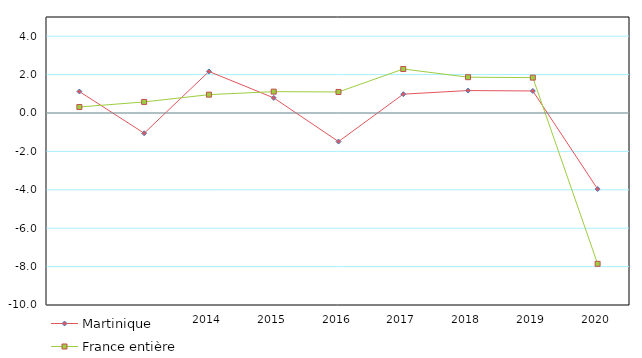
| Category | Martinique | France entière |
|---|---|---|
| 2012 | 1.119 | 0.313 |
| 2013 | -1.055 | 0.576 |
| 2014 | 2.164 | 0.956 |
| 2015 | 0.787 | 1.113 |
| 2016 | -1.488 | 1.095 |
| 2017 | 0.981 | 2.291 |
| 2018 | 1.169 | 1.865 |
| 2019 | 1.148 | 1.843 |
| 2020 | -3.959 | -7.855 |